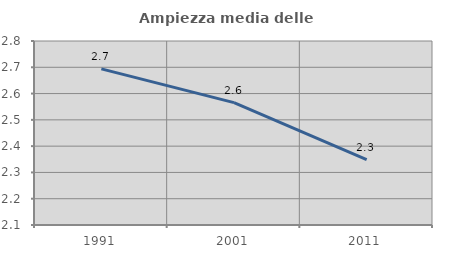
| Category | Ampiezza media delle famiglie |
|---|---|
| 1991.0 | 2.694 |
| 2001.0 | 2.565 |
| 2011.0 | 2.348 |